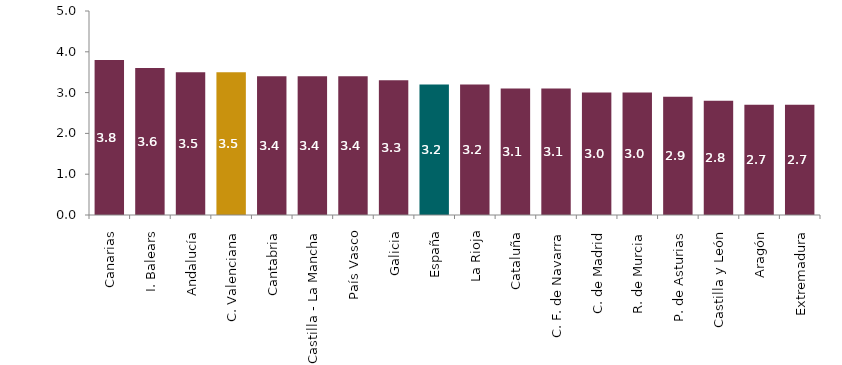
| Category | Series 0 |
|---|---|
| Canarias | 3.8 |
| I. Balears | 3.6 |
| Andalucía | 3.5 |
| C. Valenciana | 3.5 |
| Cantabria | 3.4 |
| Castilla - La Mancha | 3.4 |
| País Vasco | 3.4 |
| Galicia | 3.3 |
| España | 3.2 |
| La Rioja | 3.2 |
| Cataluña | 3.1 |
| C. F. de Navarra | 3.1 |
| C. de Madrid | 3 |
| R. de Murcia | 3 |
| P. de Asturias | 2.9 |
| Castilla y León | 2.8 |
| Aragón | 2.7 |
| Extremadura | 2.7 |